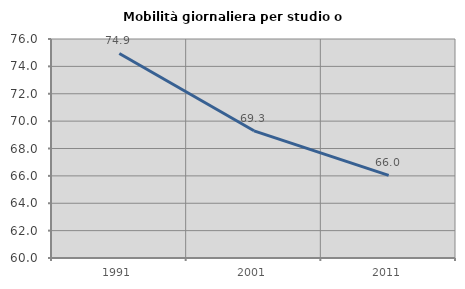
| Category | Mobilità giornaliera per studio o lavoro |
|---|---|
| 1991.0 | 74.945 |
| 2001.0 | 69.292 |
| 2011.0 | 66.04 |